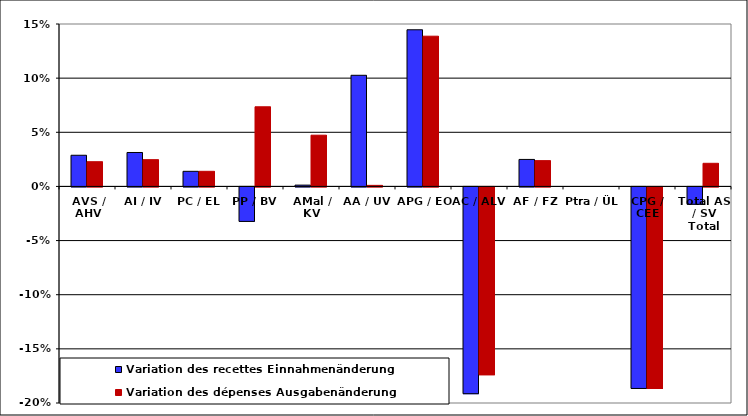
| Category | Variation des recettes | Variation des dépenses |
|---|---|---|
| AVS / AHV | 0.029 | 0.023 |
| AI / IV | 0.031 | 0.025 |
| PC / EL | 0.014 | 0.014 |
| PP / BV | -0.032 | 0.074 |
| AMal / KV | 0.001 | 0.047 |
| AA / UV | 0.103 | 0.001 |
| APG / EO | 0.145 | 0.139 |
| AC / ALV | -0.191 | -0.173 |
| AF / FZ | 0.025 | 0.024 |
| Ptra / ÜL | 0 | 0 |
| CPG / CEE | -0.186 | -0.186 |
| Total AS / SV Total | -0.016 | 0.021 |